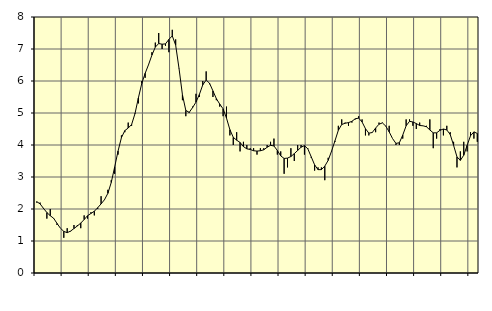
| Category | Piggar | Series 1 |
|---|---|---|
| nan | 2.2 | 2.23 |
| 87.0 | 2.2 | 2.16 |
| 87.0 | 2 | 2.02 |
| 87.0 | 1.7 | 1.89 |
| nan | 2 | 1.79 |
| 88.0 | 1.7 | 1.71 |
| 88.0 | 1.5 | 1.55 |
| 88.0 | 1.4 | 1.4 |
| nan | 1.1 | 1.3 |
| 89.0 | 1.4 | 1.26 |
| 89.0 | 1.3 | 1.31 |
| 89.0 | 1.5 | 1.39 |
| nan | 1.5 | 1.47 |
| 90.0 | 1.4 | 1.56 |
| 90.0 | 1.8 | 1.67 |
| 90.0 | 1.7 | 1.79 |
| nan | 1.9 | 1.86 |
| 91.0 | 1.8 | 1.93 |
| 91.0 | 2 | 2.04 |
| 91.0 | 2.4 | 2.16 |
| nan | 2.3 | 2.29 |
| 92.0 | 2.6 | 2.49 |
| 92.0 | 2.9 | 2.83 |
| 92.0 | 3.1 | 3.31 |
| nan | 3.7 | 3.81 |
| 93.0 | 4.3 | 4.23 |
| 93.0 | 4.4 | 4.45 |
| 93.0 | 4.7 | 4.53 |
| nan | 4.6 | 4.64 |
| 94.0 | 5 | 4.98 |
| 94.0 | 5.3 | 5.47 |
| 94.0 | 6 | 5.92 |
| nan | 6.1 | 6.24 |
| 95.0 | 6.5 | 6.51 |
| 95.0 | 6.9 | 6.81 |
| 95.0 | 7.2 | 7.06 |
| nan | 7.5 | 7.17 |
| 96.0 | 7 | 7.15 |
| 96.0 | 7.1 | 7.16 |
| 96.0 | 6.9 | 7.3 |
| nan | 7.6 | 7.41 |
| 97.0 | 7.3 | 7.12 |
| 97.0 | 6.4 | 6.39 |
| 97.0 | 5.4 | 5.57 |
| nan | 4.9 | 5.08 |
| 98.0 | 5 | 5.02 |
| 98.0 | 5.2 | 5.17 |
| 98.0 | 5.6 | 5.34 |
| nan | 5.5 | 5.58 |
| 99.0 | 6 | 5.88 |
| 99.0 | 6.3 | 6.03 |
| 99.0 | 5.9 | 5.93 |
| nan | 5.5 | 5.69 |
| 0.0 | 5.4 | 5.45 |
| 0.0 | 5.2 | 5.28 |
| 0.0 | 4.9 | 5.13 |
| nan | 5.2 | 4.84 |
| 1.0 | 4.3 | 4.48 |
| 1.0 | 4 | 4.24 |
| 1.0 | 4.4 | 4.15 |
| nan | 3.8 | 4.08 |
| 2.0 | 4.1 | 3.95 |
| 2.0 | 4 | 3.88 |
| 2.0 | 3.9 | 3.86 |
| nan | 3.9 | 3.82 |
| 3.0 | 3.7 | 3.81 |
| 3.0 | 3.9 | 3.82 |
| 3.0 | 3.9 | 3.85 |
| nan | 4 | 3.93 |
| 4.0 | 4.1 | 3.99 |
| 4.0 | 4.2 | 3.97 |
| 4.0 | 3.7 | 3.83 |
| nan | 3.8 | 3.66 |
| 5.0 | 3.1 | 3.58 |
| 5.0 | 3.3 | 3.59 |
| 5.0 | 3.9 | 3.64 |
| nan | 3.5 | 3.73 |
| 6.0 | 4 | 3.83 |
| 6.0 | 4 | 3.93 |
| 6.0 | 3.7 | 3.98 |
| nan | 3.9 | 3.88 |
| 7.0 | 3.6 | 3.63 |
| 7.0 | 3.2 | 3.38 |
| 7.0 | 3.3 | 3.23 |
| nan | 3.3 | 3.23 |
| 8.0 | 2.9 | 3.34 |
| 8.0 | 3.6 | 3.52 |
| 8.0 | 3.8 | 3.81 |
| nan | 4.1 | 4.13 |
| 9.0 | 4.6 | 4.46 |
| 9.0 | 4.8 | 4.64 |
| 9.0 | 4.7 | 4.68 |
| nan | 4.6 | 4.7 |
| 10.0 | 4.7 | 4.74 |
| 10.0 | 4.8 | 4.82 |
| 10.0 | 4.9 | 4.84 |
| nan | 4.8 | 4.72 |
| 11.0 | 4.3 | 4.51 |
| 11.0 | 4.3 | 4.37 |
| 11.0 | 4.4 | 4.39 |
| nan | 4.4 | 4.53 |
| 12.0 | 4.7 | 4.65 |
| 12.0 | 4.7 | 4.69 |
| 12.0 | 4.6 | 4.59 |
| nan | 4.6 | 4.41 |
| 13.0 | 4.2 | 4.2 |
| 13.0 | 4 | 4.05 |
| 13.0 | 4 | 4.07 |
| nan | 4.2 | 4.31 |
| 14.0 | 4.8 | 4.6 |
| 14.0 | 4.8 | 4.74 |
| 14.0 | 4.6 | 4.72 |
| nan | 4.5 | 4.67 |
| 15.0 | 4.7 | 4.61 |
| 15.0 | 4.6 | 4.6 |
| 15.0 | 4.6 | 4.57 |
| nan | 4.8 | 4.47 |
| 16.0 | 3.9 | 4.38 |
| 16.0 | 4.2 | 4.38 |
| 16.0 | 4.5 | 4.46 |
| nan | 4.3 | 4.5 |
| 17.0 | 4.6 | 4.47 |
| 17.0 | 4.4 | 4.33 |
| 17.0 | 4.1 | 3.99 |
| nan | 3.3 | 3.63 |
| 18.0 | 3.8 | 3.52 |
| 18.0 | 4.1 | 3.68 |
| 18.0 | 3.8 | 3.99 |
| nan | 4.4 | 4.29 |
| 19.0 | 4.2 | 4.41 |
| 19.0 | 4.1 | 4.36 |